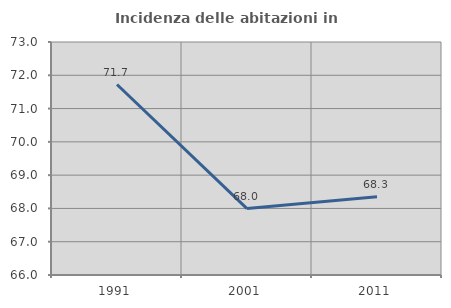
| Category | Incidenza delle abitazioni in proprietà  |
|---|---|
| 1991.0 | 71.723 |
| 2001.0 | 67.996 |
| 2011.0 | 68.348 |